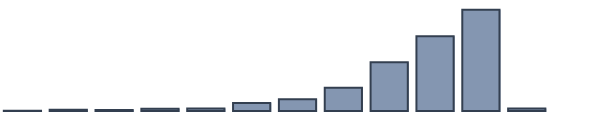
| Category | Series 0 |
|---|---|
| 0 | 0.13 |
| 1 | 0.435 |
| 2 | 0.348 |
| 3 | 0.783 |
| 4 | 0.87 |
| 5 | 2.87 |
| 6 | 4.261 |
| 7 | 8.348 |
| 8 | 17.565 |
| 9 | 26.957 |
| 10 | 36.522 |
| 11 | 0.913 |
| 12 | 0 |